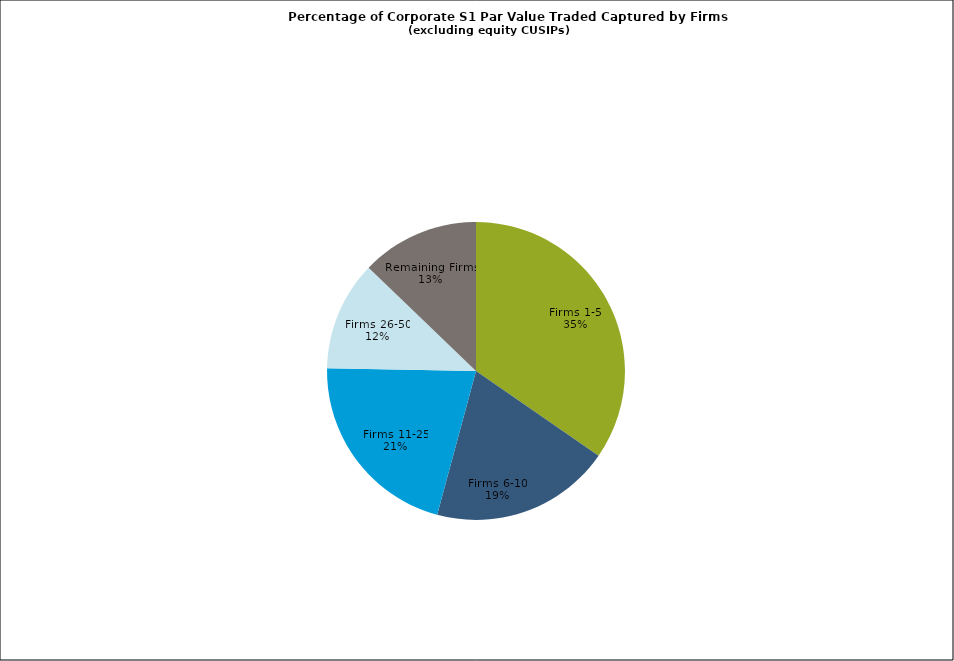
| Category | Series 0 |
|---|---|
| Firms 1-5 | 0.346 |
| Firms 6-10 | 0.196 |
| Firms 11-25 | 0.211 |
| Firms 26-50 | 0.119 |
| Remaining Firms | 0.128 |